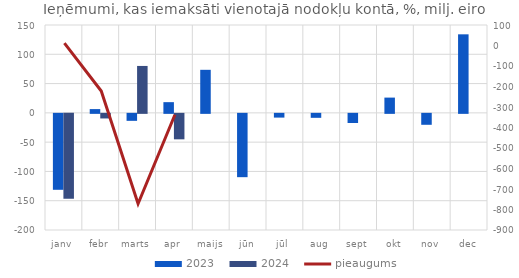
| Category | 2023 | 2024 |
|---|---|---|
| janv | -129.655 | -144.84 |
| febr | 6.432 | -7.853 |
| marts | -11.924 | 80.097 |
| apr | 18.271 | -43.49 |
| maijs | 73.488 | 0 |
| jūn | -108.101 | 0 |
| jūl | -6.389 | 0 |
| aug | -6.777 | 0 |
| sept | -15.613 | 0 |
| okt | 26.046 | 0 |
| nov | -18.673 | 0 |
| dec | 134.083 | 0 |